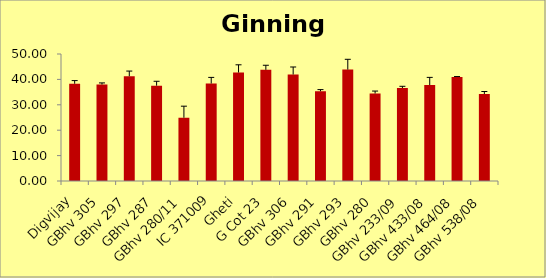
| Category | Ginning % |
|---|---|
| Digvijay | 38.284 |
| GBhv 305 | 37.981 |
| GBhv 297 | 41.247 |
| GBhv 287 | 37.53 |
| GBhv 280/11 | 24.904 |
| IC 371009 | 38.379 |
| Gheti | 42.713 |
| G Cot 23 | 43.762 |
| GBhv 306 | 41.927 |
| GBhv 291 | 35.341 |
| GBhv 293 | 43.865 |
| GBhv 280 | 34.44 |
| GBhv 233/09 | 36.618 |
| GBhv 433/08 | 37.775 |
| GBhv 464/08 | 40.988 |
| GBhv 538/08 | 34.249 |